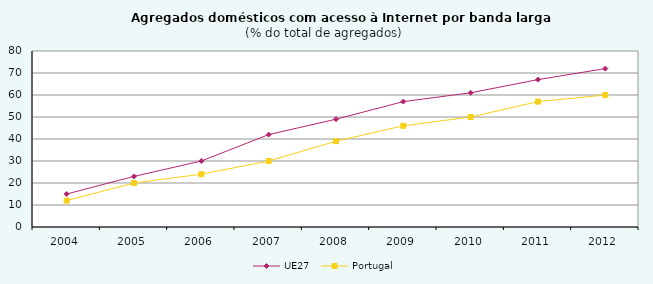
| Category | UE27 | Portugal |
|---|---|---|
| 2004 | 15 | 12 |
| 2005 | 23 | 20 |
| 2006 | 30 | 24 |
| 2007 | 42 | 30 |
| 2008 | 49 | 39 |
| 2009 | 57 | 46 |
| 2010 | 61 | 50 |
| 2011 | 67 | 57 |
| 2012 | 72 | 60 |